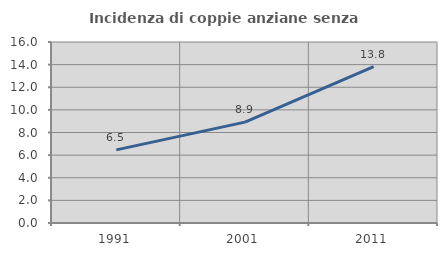
| Category | Incidenza di coppie anziane senza figli  |
|---|---|
| 1991.0 | 6.467 |
| 2001.0 | 8.919 |
| 2011.0 | 13.816 |